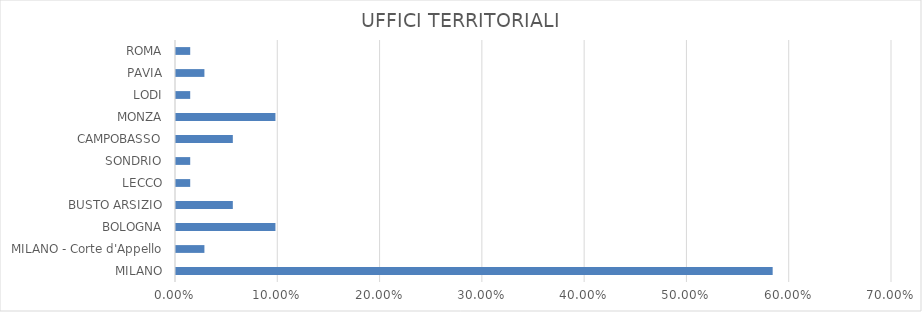
| Category | Series 0 |
|---|---|
| MILANO | 0.583 |
| MILANO - Corte d'Appello | 0.028 |
| BOLOGNA | 0.097 |
| BUSTO ARSIZIO | 0.056 |
| LECCO | 0.014 |
| SONDRIO | 0.014 |
| CAMPOBASSO | 0.056 |
| MONZA | 0.097 |
| LODI | 0.014 |
| PAVIA | 0.028 |
| ROMA | 0.014 |